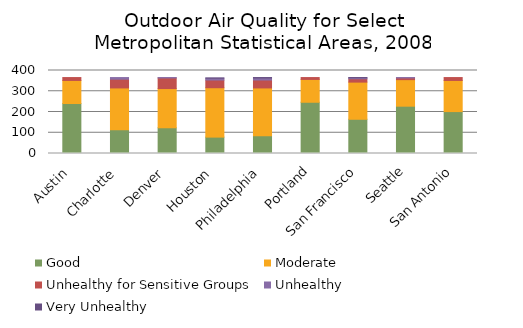
| Category | Good | Moderate | Unhealthy for Sensitive Groups | Unhealthy   | Very Unhealthy |
|---|---|---|---|---|---|
| Austin | 241 | 111 | 14 | 0 | 0 |
| Charlotte | 114 | 202 | 42 | 8 | 0 |
| Denver | 124 | 189 | 51 | 2 | 0 |
| Houston | 79 | 238 | 37 | 9 | 1 |
| Philadelphia | 85 | 231 | 38 | 10 | 2 |
| Portland | 247 | 110 | 9 | 0 | 0 |
| San Francisco | 165 | 179 | 16 | 5 | 1 |
| Seattle | 228 | 128 | 8 | 2 | 0 |
| San Antonio | 202 | 150 | 14 | 0 | 0 |